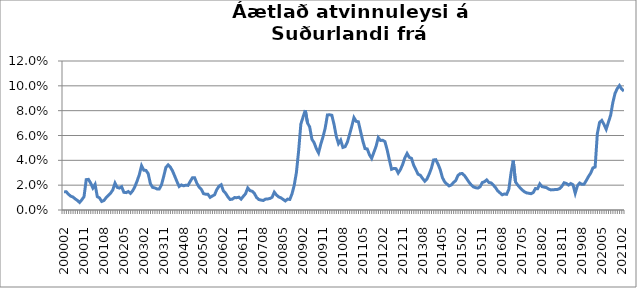
| Category | Series 0 |
|---|---|
| 200002 | 0.015 |
| 200003 | 0.015 |
| 200004 | 0.013 |
| 200005 | 0.011 |
| 200006 | 0.01 |
| 200007 | 0.009 |
| 200008 | 0.008 |
| 200009 | 0.006 |
| 200010 | 0.008 |
| 200011 | 0.011 |
| 200012 | 0.024 |
| 200101 | 0.025 |
| 200102 | 0.022 |
| 200103 | 0.018 |
| 200104 | 0.021 |
| 200105 | 0.011 |
| 200106 | 0.01 |
| 200107 | 0.007 |
| 200108 | 0.008 |
| 200109 | 0.01 |
| 200110 | 0.012 |
| 200111 | 0.014 |
| 200112 | 0.016 |
| 200201 | 0.022 |
| 200202 | 0.018 |
| 200203 | 0.018 |
| 200204 | 0.019 |
| 200205 | 0.014 |
| 200206 | 0.014 |
| 200207 | 0.015 |
| 200208 | 0.013 |
| 200209 | 0.015 |
| 200210 | 0.019 |
| 200211 | 0.023 |
| 200212 | 0.029 |
| 200301 | 0.036 |
| 200302 | 0.032 |
| 200303 | 0.032 |
| 200304 | 0.029 |
| 200305 | 0.021 |
| 200306 | 0.018 |
| 200307 | 0.018 |
| 200308 | 0.017 |
| 200309 | 0.017 |
| 200310 | 0.02 |
| 200311 | 0.027 |
| 200312 | 0.034 |
| 200401 | 0.036 |
| 200402 | 0.035 |
| 200403 | 0.031 |
| 200404 | 0.027 |
| 200405 | 0.023 |
| 200406 | 0.019 |
| 200407 | 0.02 |
| 200408 | 0.019 |
| 200409 | 0.02 |
| 200410 | 0.02 |
| 200411 | 0.023 |
| 200412 | 0.026 |
| 200501 | 0.026 |
| 200502 | 0.022 |
| 200503 | 0.018 |
| 200504 | 0.017 |
| 200505 | 0.013 |
| 200506 | 0.013 |
| 200507 | 0.013 |
| 200508 | 0.01 |
| 200509 | 0.011 |
| 200510 | 0.012 |
| 200511 | 0.016 |
| 200512 | 0.019 |
| 200601 | 0.02 |
| 200602 | 0.015 |
| 200603 | 0.013 |
| 200604 | 0.011 |
| 200605 | 0.008 |
| 200606 | 0.009 |
| 200607 | 0.01 |
| 200608 | 0.01 |
| 200609 | 0.01 |
| 200610 | 0.009 |
| 200611 | 0.011 |
| 200612 | 0.013 |
| 200701 | 0.018 |
| 200702 | 0.016 |
| 200703 | 0.015 |
| 200704 | 0.013 |
| 200705 | 0.01 |
| 200706 | 0.008 |
| 200707 | 0.008 |
| 200708 | 0.008 |
| 200709 | 0.009 |
| 200710 | 0.009 |
| 200711 | 0.009 |
| 200712 | 0.01 |
| 200801 | 0.014 |
| 200802 | 0.012 |
| 200803 | 0.011 |
| 200804 | 0.01 |
| 200805 | 0.008 |
| 200806 | 0.007 |
| 200807 | 0.009 |
| 200808 | 0.008 |
| 200809 | 0.013 |
| 200810 | 0.02 |
| 200811 | 0.03 |
| 200812 | 0.048 |
| 200901 | 0.069 |
| 200902 | 0.075 |
| 200903 | 0.08 |
| 200904 | 0.07 |
| 200905 | 0.067 |
| 200906 | 0.057 |
| 200907 | 0.054 |
| 200908 | 0.049 |
| 200909 | 0.046 |
| 200910 | 0.053 |
| 200911 | 0.059 |
| 200912 | 0.066 |
| 201001 | 0.077 |
| 201002 | 0.077 |
| 201003 | 0.076 |
| 201004 | 0.069 |
| 201005 | 0.059 |
| 201006 | 0.053 |
| 201007 | 0.056 |
| 201008 | 0.05 |
| 201009 | 0.051 |
| 201010 | 0.054 |
| 201011 | 0.061 |
| 201012 | 0.067 |
| 201101 | 0.074 |
| 201102 | 0.071 |
| 201103 | 0.071 |
| 201104 | 0.063 |
| 201105 | 0.056 |
| 201106 | 0.049 |
| 201107 | 0.049 |
| 201108 | 0.044 |
| 201109 | 0.042 |
| 201110 | 0.046 |
| 201111 | 0.051 |
| 201112 | 0.058 |
| 201201 | 0.056 |
| 201202 | 0.056 |
| 201203 | 0.055 |
| 201204 | 0.048 |
| 201205 | 0.04 |
| 201206 | 0.033 |
| 201207 | 0.033 |
| 201208 | 0.033 |
| 201209 | 0.03 |
| 201210 | 0.033 |
| 201211 | 0.037 |
| 201212 | 0.042 |
| 201301 | 0.046 |
| 201302 | 0.042 |
| 201303 | 0.042 |
| 201304 | 0.036 |
| 201305 | 0.032 |
| 201306 | 0.029 |
| 201307 | 0.028 |
| 201308 | 0.025 |
| 201309 | 0.023 |
| 201310 | 0.025 |
| 201311 | 0.029 |
| 201312 | 0.034 |
| 201401 | 0.04 |
| 201402 | 0.041 |
| 201403 | 0.037 |
| 201404 | 0.032 |
| 201405 | 0.026 |
| 201406 | 0.023 |
| 201407 | 0.021 |
| 201408 | 0.019 |
| 201409 | 0.02 |
| 201410 | 0.022 |
| 201411 | 0.024 |
| 201412 | 0.028 |
| 201501 | 0.029 |
| 201502 | 0.029 |
| 201503 | 0.028 |
| 201504 | 0.025 |
| 201505 | 0.022 |
| 201506 | 0.02 |
| 201507 | 0.019 |
| 201508 | 0.018 |
| 201509 | 0.018 |
| 201510 | 0.019 |
| 201511 | 0.022 |
| 201512 | 0.023 |
| 201601 | 0.024 |
| 201602 | 0.022 |
| 201603 | 0.022 |
| 201604 | 0.02 |
| 201605 | 0.018 |
| 201606 | 0.015 |
| 201607 | 0.014 |
| 201608 | 0.012 |
| 201609 | 0.013 |
| 201610 | 0.013 |
| 201611 | 0.017 |
| 201612 | 0.03 |
| 201701 | 0.04 |
| 201702 | 0.023 |
| 201703 | 0.02 |
| 201704 | 0.018 |
| 201705 | 0.016 |
| 201706 | 0.015 |
| 201707 | 0.014 |
| 201708 | 0.014 |
| 201709 | 0.013 |
| 201710 | 0.014 |
| 201711 | 0.017 |
| 201712 | 0.017 |
| 201801 | 0.021 |
| 201802 | 0.019 |
| 201803 | 0.018 |
| 201804 | 0.018 |
| 201805 | 0.017 |
| 201806 | 0.016 |
| 201807 | 0.016 |
| 201808 | 0.017 |
| 201809 | 0.017 |
| 201810 | 0.017 |
| 201811 | 0.019 |
| 201812 | 0.022 |
| 201901 | 0.021 |
| 201902 | 0.02 |
| 201903 | 0.021 |
| 201904 | 0.02 |
| 201905 | 0.013 |
| 201906 | 0.02 |
| 201907 | 0.022 |
| 201908 | 0.021 |
| 201909 | 0.021 |
| 201910 | 0.024 |
| 201911 | 0.027 |
| 201912 | 0.03 |
| 202001(a) | 0.034 |
| 202002 | 0.035 |
| 202003***  | 0.061 |
| 202004 | 0.071 |
| 202005 | 0.072 |
| 202006 | 0.069 |
| 202007 | 0.065 |
| 202008 | 0.071 |
| 202009 | 0.076 |
| 202010 | 0.086 |
| 202011 | 0.094 |
| 202012 | 0.098 |
| 202101 | 0.1 |
| 202102 | 0.097 |
| 202103 | 0.096 |